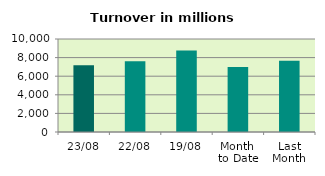
| Category | Series 0 |
|---|---|
| 23/08 | 7181.162 |
| 22/08 | 7612.231 |
| 19/08 | 8757.454 |
| Month 
to Date | 6987.938 |
| Last
Month | 7648.819 |